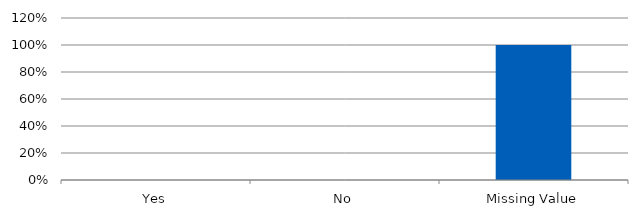
| Category | Total |
|---|---|
| Yes | 0 |
| No | 0 |
| Missing Value | 1 |